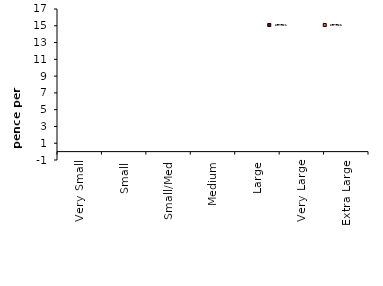
| Category | Series 0 | Series 1 |
|---|---|---|
| Very Small | 0 | 0 |
| Small | 0 | 0 |
| Small/Med | 0 | 0 |
| Medium | 0 | 0 |
| Large | 0 | 0 |
| Very Large | 0 | 0 |
| Extra Large | 0 | 0 |